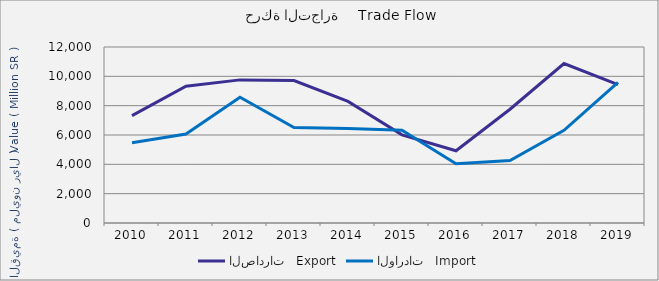
| Category | الصادرات   Export | الواردات   Import |
|---|---|---|
| 2010.0 | 7322580075 | 5467010640 |
| 2011.0 | 9321640473 | 6066481770 |
| 2012.0 | 9757979053 | 8574247141 |
| 2013.0 | 9713390199 | 6509101253 |
| 2014.0 | 8291134252 | 6435063791 |
| 2015.0 | 6008246399 | 6322069553 |
| 2016.0 | 4926306038 | 4034831813 |
| 2017.0 | 7756655728 | 4260943789 |
| 2018.0 | 10870634742 | 6322928810 |
| 2019.0 | 9429658173 | 9586140143 |